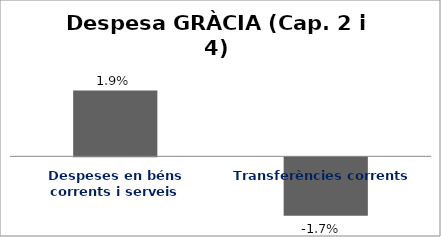
| Category | Series 0 |
|---|---|
| Despeses en béns corrents i serveis | 0.019 |
| Transferències corrents | -0.017 |